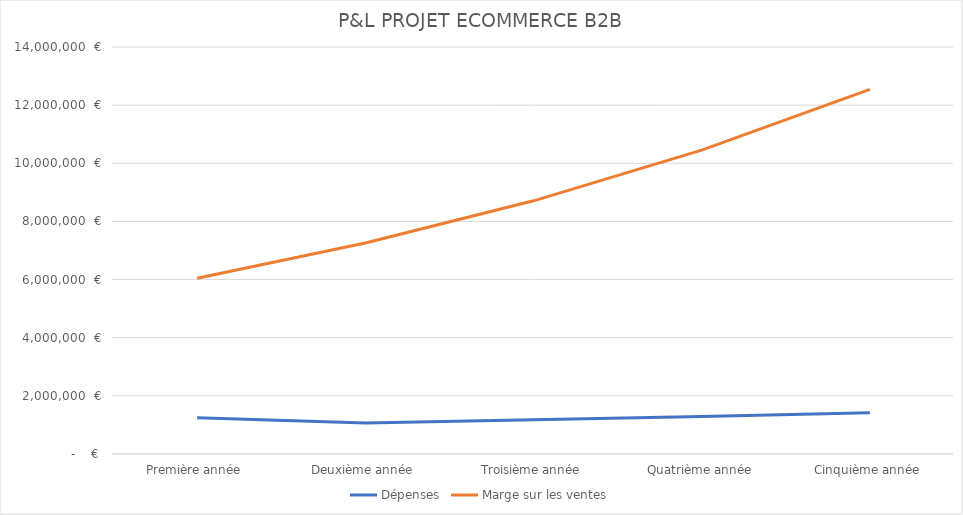
| Category | Dépenses | Marge sur les ventes |
|---|---|---|
| Première année | 1249038 | 6048000 |
| Deuxième année | 1069088 | 7257600 |
| Troisième année | 1175996.8 | 8709120 |
| Quatrième année | 1293596.48 | 10450944 |
| Cinquième année | 1422956.128 | 12541132.8 |